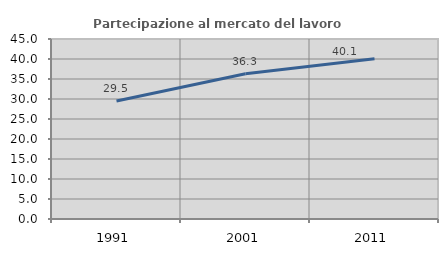
| Category | Partecipazione al mercato del lavoro  femminile |
|---|---|
| 1991.0 | 29.521 |
| 2001.0 | 36.309 |
| 2011.0 | 40.056 |